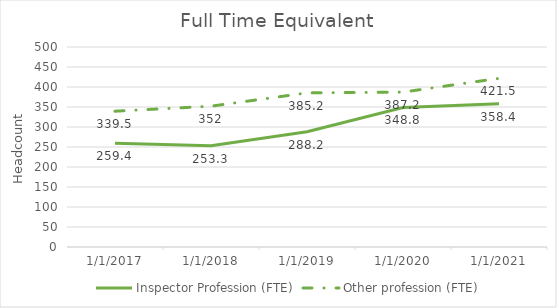
| Category | Inspector Profession (FTE) | Other profession (FTE) |
|---|---|---|
| 3/31/17 | 259.4 | 339.5 |
| 3/31/18 | 253.3 | 352 |
| 3/31/19 | 288.2 | 385.2 |
| 3/31/20 | 348.8 | 387.2 |
| 3/31/21 | 358.4 | 421.5 |